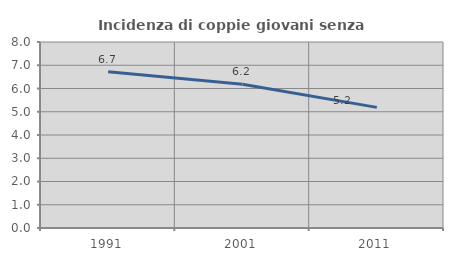
| Category | Incidenza di coppie giovani senza figli |
|---|---|
| 1991.0 | 6.725 |
| 2001.0 | 6.181 |
| 2011.0 | 5.189 |